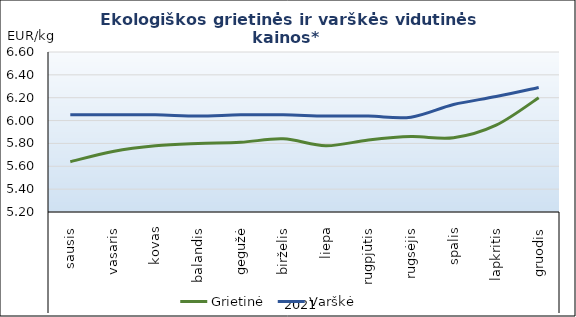
| Category | Grietinė | Varškė |
|---|---|---|
| 0 | 5.64 | 6.05 |
| 1 | 5.73 | 6.05 |
| 2 | 5.78 | 6.05 |
| 3 | 5.8 | 6.04 |
| 4 | 5.81 | 6.05 |
| 5 | 5.84 | 6.05 |
| 6 | 5.78 | 6.04 |
| 7 | 5.83 | 6.04 |
| 8 | 5.86 | 6.03 |
| 9 | 5.85 | 6.14 |
| 10 | 5.96 | 6.21 |
| 11 | 6.2 | 6.29 |